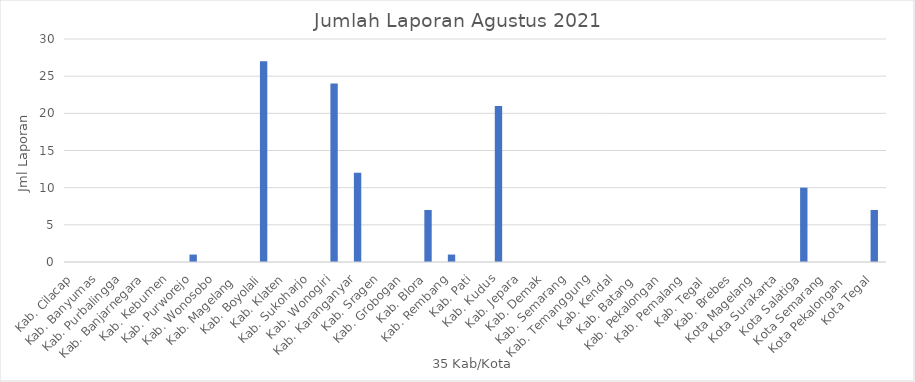
| Category | Series 0 |
|---|---|
| Kab. Cilacap | 0 |
| Kab. Banyumas | 0 |
| Kab. Purbalingga | 0 |
| Kab. Banjarnegara | 0 |
| Kab. Kebumen | 0 |
| Kab. Purworejo | 1 |
| Kab. Wonosobo | 0 |
| Kab. Magelang  | 0 |
| Kab. Boyolali | 27 |
| Kab. Klaten | 0 |
| Kab. Sukoharjo | 0 |
| Kab. Wonogiri | 24 |
| Kab. Karanganyar | 12 |
| Kab. Sragen | 0 |
| Kab. Grobogan | 0 |
| Kab. Blora | 7 |
| Kab. Rembang | 1 |
| Kab. Pati | 0 |
| Kab. Kudus | 21 |
| Kab. Jepara | 0 |
| Kab. Demak | 0 |
| Kab. Semarang | 0 |
| Kab. Temanggung | 0 |
| Kab. Kendal | 0 |
| Kab. Batang  | 0 |
| Kab. Pekalongan | 0 |
| Kab. Pemalang | 0 |
| Kab. Tegal  | 0 |
| Kab. Brebes | 0 |
| Kota Magelang | 0 |
| Kota Surakarta | 0 |
| Kota Salatiga | 10 |
| Kota Semarang | 0 |
| Kota Pekalongan  | 0 |
| Kota Tegal | 7 |